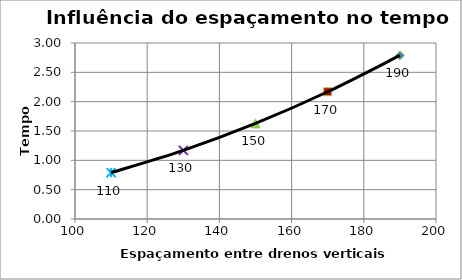
| Category | U = 0,95 |
|---|---|
| 190.0 | 2.788 |
| 170.0 | 2.169 |
| 150.0 | 1.629 |
| 130.0 | 1.17 |
| 110.0 | 0.79 |